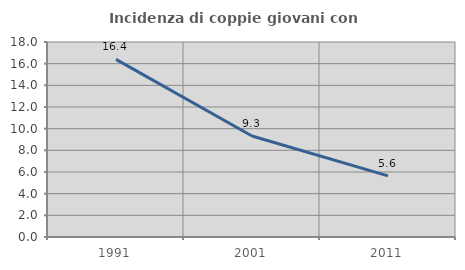
| Category | Incidenza di coppie giovani con figli |
|---|---|
| 1991.0 | 16.4 |
| 2001.0 | 9.328 |
| 2011.0 | 5.644 |